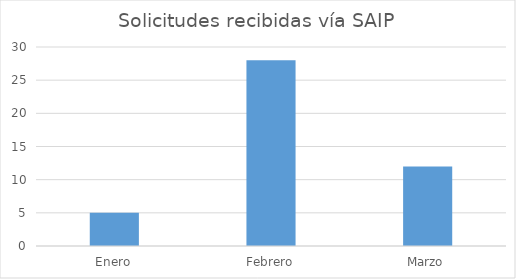
| Category | Series 0 |
|---|---|
| Enero | 5 |
| Febrero | 28 |
| Marzo | 12 |